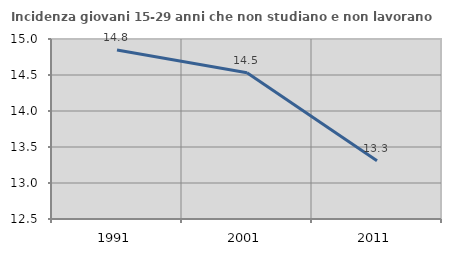
| Category | Incidenza giovani 15-29 anni che non studiano e non lavorano  |
|---|---|
| 1991.0 | 14.848 |
| 2001.0 | 14.532 |
| 2011.0 | 13.31 |